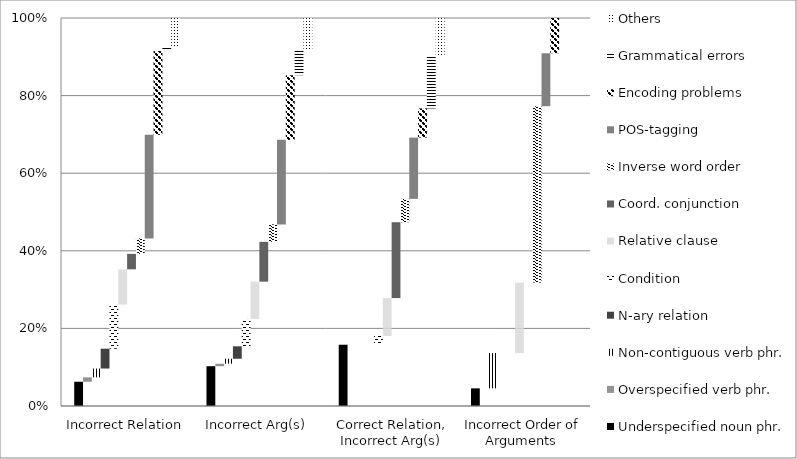
| Category | Underspecified noun phr. | Overspecified verb phr. | Non-contiguous verb phr. | N-ary relation   | Condition | Relative clause | Coord. conjunction | Inverse word order | POS-tagging | Encoding problems | Grammatical errors | Others |
|---|---|---|---|---|---|---|---|---|---|---|---|---|
| Incorrect Relation | 0.11 | 0.02 | 0.04 | 0.09 | 0.2 | 0.16 | 0.07 | 0.07 | 0.47 | 0.38 | 0.02 | 0.13 |
| Incorrect Arg(s) | 0.16 | 0.01 | 0.02 | 0.05 | 0.11 | 0.15 | 0.16 | 0.07 | 0.34 | 0.26 | 0.1 | 0.13 |
| Correct Relation, Incorrect Arg(s) | 0.21 | 0 | 0 | 0 | 0.03 | 0.13 | 0.26 | 0.08 | 0.21 | 0.1 | 0.18 | 0.13 |
| Incorrect Order of Arguments  | 0.1 | 0 | 0.2 | 0 | 0 | 0.4 | 0 | 1 | 0.3 | 0.2 | 0 | 0 |